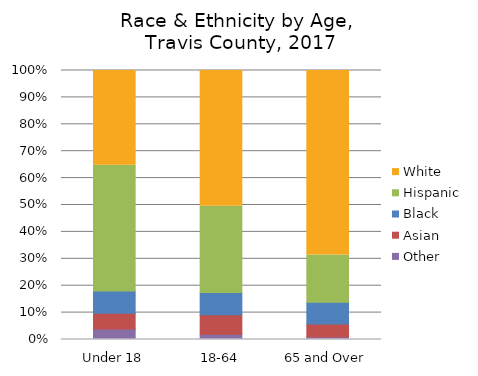
| Category | Other | Asian | Black | Hispanic | White |
|---|---|---|---|---|---|
| Under 18 | 0.039 | 0.059 | 0.082 | 0.468 | 0.352 |
| 18-64 | 0.019 | 0.073 | 0.083 | 0.32 | 0.504 |
| 65 and Over | 0.009 | 0.048 | 0.081 | 0.176 | 0.685 |